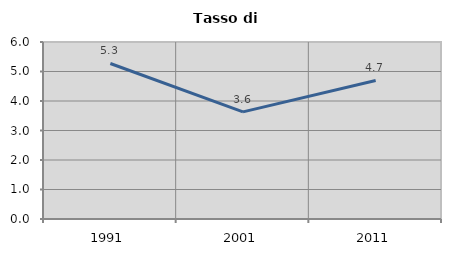
| Category | Tasso di disoccupazione   |
|---|---|
| 1991.0 | 5.272 |
| 2001.0 | 3.631 |
| 2011.0 | 4.697 |